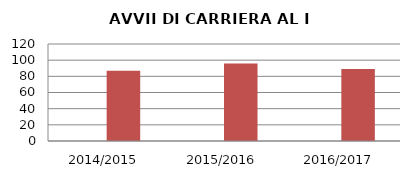
| Category | ANNO | NUMERO |
|---|---|---|
| 2014/2015 | 0 | 87 |
| 2015/2016 | 0 | 96 |
| 2016/2017 | 0 | 89 |